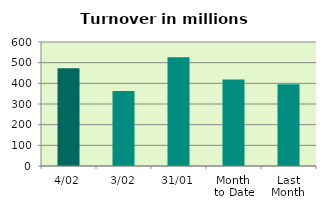
| Category | Series 0 |
|---|---|
| 4/02 | 473.051 |
| 3/02 | 363.273 |
| 31/01 | 526.387 |
| Month 
to Date | 418.162 |
| Last
Month | 396.049 |